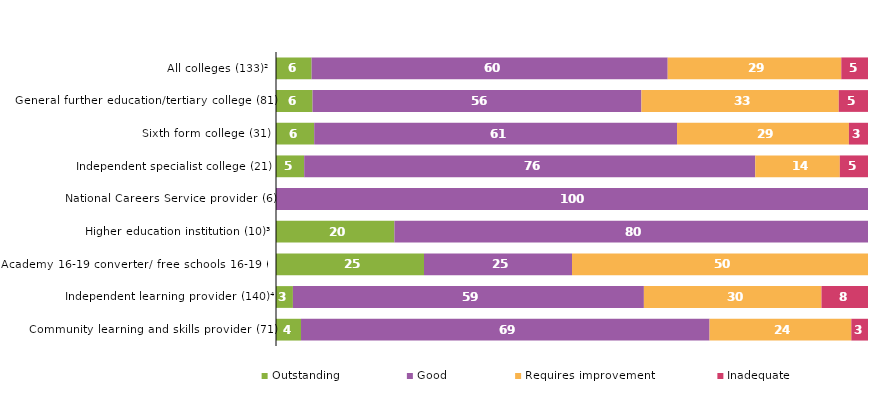
| Category | Outstanding | Good | Requires improvement | Inadequate |
|---|---|---|---|---|
| All colleges (133)² | 6.015 | 60.15 | 29.323 | 4.511 |
| General further education/tertiary college (81) | 6.173 | 55.556 | 33.333 | 4.938 |
| Sixth form college (31) | 6.452 | 61.29 | 29.032 | 3.226 |
| Independent specialist college (21) | 4.762 | 76.19 | 14.286 | 4.762 |
| National Careers Service provider (6) | 0 | 100 | 0 | 0 |
| Higher education institution (10)³ | 20 | 80 | 0 | 0 |
| Academy 16-19 converter/ free schools 16-19 (4) | 25 | 25 | 50 | 0 |
| Independent learning provider (140)⁴ | 2.857 | 59.286 | 30 | 7.857 |
| Community learning and skills provider (71) | 4.225 | 69.014 | 23.944 | 2.817 |